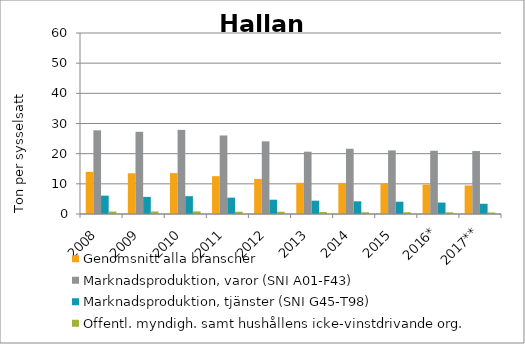
| Category | Genomsnitt alla branscher | Marknadsproduktion, varor (SNI A01-F43) | Marknadsproduktion, tjänster (SNI G45-T98) | Offentl. myndigh. samt hushållens icke-vinstdrivande org. |
|---|---|---|---|---|
| 2008 | 13.965 | 27.73 | 6.084 | 0.81 |
| 2009 | 13.508 | 27.244 | 5.668 | 0.837 |
| 2010 | 13.565 | 27.885 | 5.909 | 0.865 |
| 2011 | 12.55 | 26.03 | 5.416 | 0.751 |
| 2012 | 11.635 | 24.087 | 4.739 | 0.746 |
| 2013 | 10.327 | 20.657 | 4.416 | 0.643 |
| 2014 | 10.299 | 21.633 | 4.203 | 0.588 |
| 2015 | 10.084 | 21.071 | 4.079 | 0.578 |
| 2016* | 9.756 | 20.964 | 3.792 | 0.564 |
| 2017** | 9.465 | 20.871 | 3.392 | 0.501 |